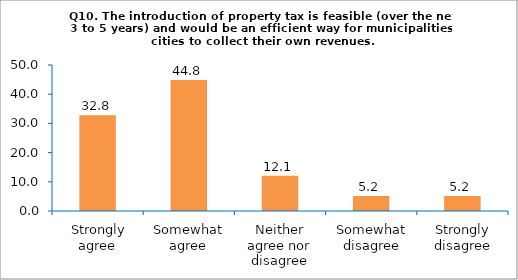
| Category | Series 0 |
|---|---|
|  Strongly agree | 32.759 |
| Somewhat agree | 44.828 |
| Neither agree nor disagree | 12.069 |
| Somewhat disagree | 5.172 |
| Strongly disagree | 5.172 |